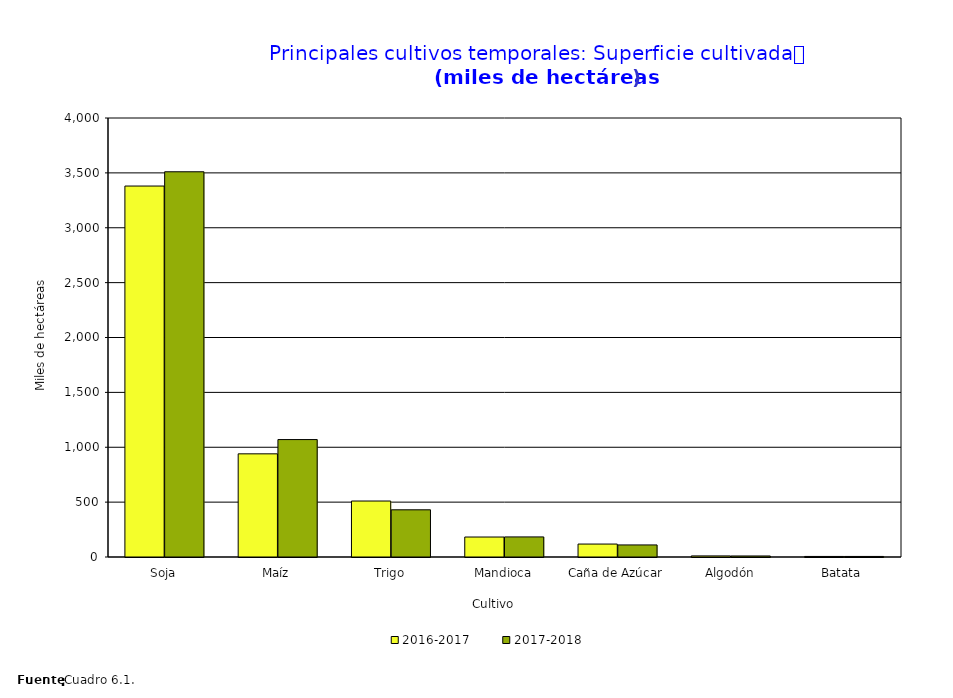
| Category | 2016-2017 | 2017-2018 |
|---|---|---|
| Soja | 3380 | 3510 |
| Maíz | 940 | 1070 |
| Trigo | 510 | 430 |
| Mandioca | 182 | 183 |
| Caña de Azúcar | 118 | 110 |
| Algodón | 10 | 9.493 |
| Batata  | 5 | 5.078 |